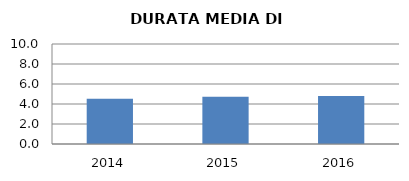
| Category | 2014 2015 2016 |
|---|---|
| 2014.0 | 4.532 |
| 2015.0 | 4.735 |
| 2016.0 | 4.797 |